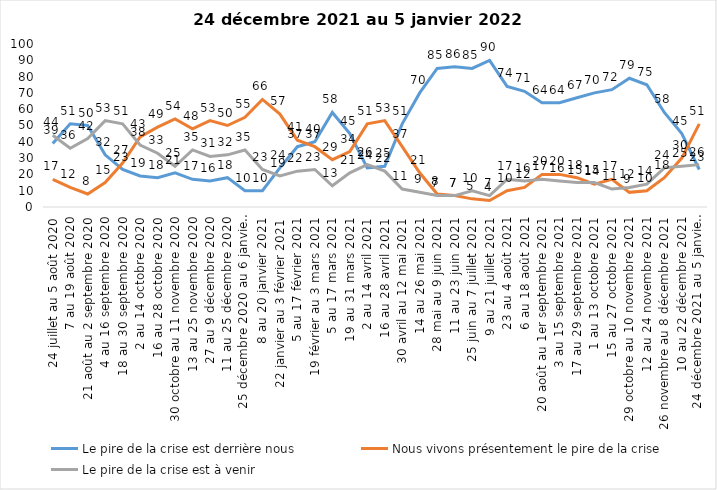
| Category | Le pire de la crise est derrière nous | Nous vivons présentement le pire de la crise | Le pire de la crise est à venir |
|---|---|---|---|
| 24 juillet au 5 août 2020 | 39 | 17 | 44 |
| 7 au 19 août 2020 | 51 | 12 | 36 |
| 21 août au 2 septembre 2020 | 50 | 8 | 42 |
| 4 au 16 septembre 2020 | 32 | 15 | 53 |
| 18 au 30 septembre 2020 | 23 | 27 | 51 |
| 2 au 14 octobre 2020 | 19 | 43 | 38 |
| 16 au 28 octobre 2020 | 18 | 49 | 33 |
| 30 octobre au 11 novembre 2020 | 21 | 54 | 25 |
| 13 au 25 novembre 2020 | 17 | 48 | 35 |
| 27 au 9 décembre 2020 | 16 | 53 | 31 |
| 11 au 25 décembre 2020 | 18 | 50 | 32 |
| 25 décembre 2020 au 6 janvier 2021 | 10 | 55 | 35 |
| 8 au 20 janvier 2021 | 10 | 66 | 23 |
| 22 janvier au 3 février 2021 | 24 | 57 | 19 |
| 5 au 17 février 2021 | 37 | 41 | 22 |
| 19 février au 3 mars 2021 | 40 | 37 | 23 |
| 5 au 17 mars 2021 | 58 | 29 | 13 |
| 19 au 31 mars 2021 | 45 | 34 | 21 |
| 2 au 14 avril 2021 | 24 | 51 | 26 |
| 16 au 28 avril 2021 | 25 | 53 | 22 |
| 30 avril au 12 mai 2021 | 51 | 37 | 11 |
| 14 au 26 mai 2021 | 70 | 21 | 9 |
| 28 mai au 9 juin 2021 | 85 | 8 | 7 |
| 11 au 23 juin 2021 | 86 | 7 | 7 |
| 25 juin au 7 juillet 2021 | 85 | 5 | 10 |
| 9 au 21 juillet 2021 | 90 | 4 | 7 |
| 23 au 4 août 2021 | 74 | 10 | 17 |
| 6 au 18 août 2021 | 71 | 12 | 16 |
| 20 août au 1er septembre 2021 | 64 | 20 | 17 |
| 3 au 15 septembre 2021 | 64 | 20 | 16 |
| 17 au 29 septembre 2021 | 67 | 18 | 15 |
| 1 au 13 octobre 2021 | 70 | 14 | 15 |
| 15 au 27 octobre 2021 | 72 | 17 | 11 |
| 29 octobre au 10 novembre 2021 | 79 | 9 | 12 |
| 12 au 24 novembre 2021 | 75 | 10 | 14 |
| 26 novembre au 8 décembre 2021 | 58 | 18 | 24 |
| 10 au 22 décembre 2021 | 45 | 30 | 25 |
| 24 décembre 2021 au 5 janvier 2022 2022 | 23 | 51 | 26 |